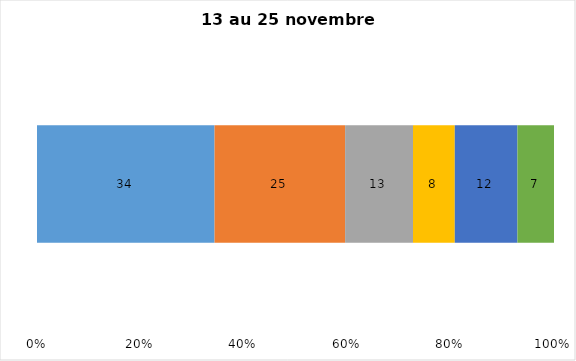
| Category | Plusieurs fois par jour | Une fois par jour | Quelques fois par semaine   | Une fois par semaine ou moins   |  Jamais   |  Je n’utilise pas les médias sociaux |
|---|---|---|---|---|---|---|
| 0 | 34 | 25 | 13 | 8 | 12 | 7 |